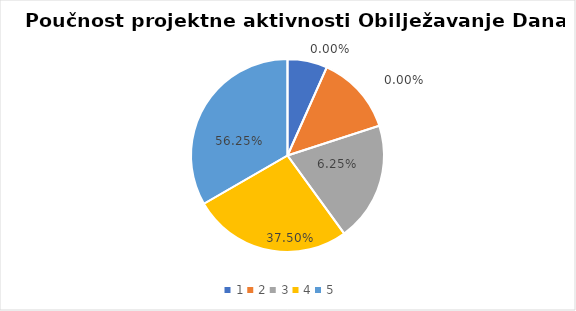
| Category | Series 0 | Series 1 |
|---|---|---|
| 0 | 1 | 0 |
| 1 | 2 | 0 |
| 2 | 3 | 0.062 |
| 3 | 4 | 0.375 |
| 4 | 5 | 0.562 |